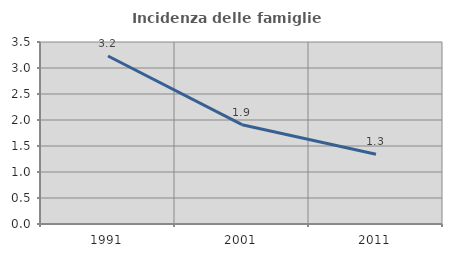
| Category | Incidenza delle famiglie numerose |
|---|---|
| 1991.0 | 3.231 |
| 2001.0 | 1.91 |
| 2011.0 | 1.342 |